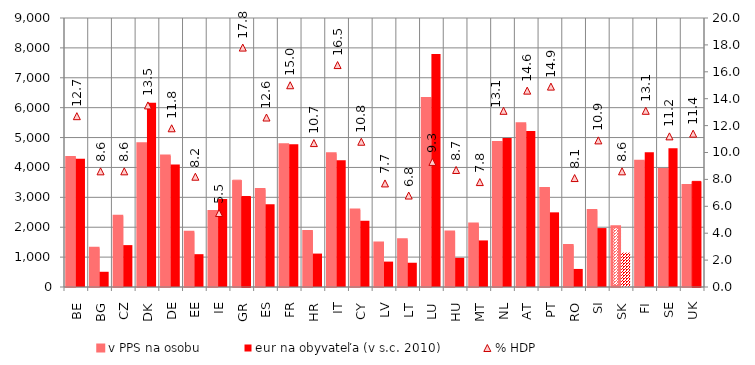
| Category | v PPS na osobu | eur na obyvateľa (v s.c. 2010) |
|---|---|---|
| BE | 4335.72 | 4288.49 |
| BG | 1292.3 | 509.42 |
| CZ | 2368.43 | 1401.28 |
| DK | 4789.89 | 6161.09 |
| DE | 4381.84 | 4101.75 |
| EE | 1827.97 | 1098.09 |
| IE | 2522.36 | 2941.98 |
| GR | 3573.8 | 3028.22 |
| ES | 3261.72 | 2768.6 |
| FR | 4761.47 | 4773.16 |
| HR | 1857.83 | 1118.34 |
| IT | 4459.66 | 4243.52 |
| CY | 2579.2 | 2216.09 |
| LV | 1472.59 | 849.8 |
| LT | 1576.84 | 811.75 |
| LU | 6302.65 | 7793.61 |
| HU | 1838.43 | 975.58 |
| MT | 2104.98 | 1558.36 |
| NL | 4834.14 | 4987.3 |
| AT | 5457.81 | 5222.71 |
| PT | 3293 | 2497.66 |
| RO | 1390.77 | 604.48 |
| SI | 2563.21 | 1971.54 |
| SK | 2016.28 | 1151.74 |
| FI | 4205.42 | 4511.24 |
| SE | 3931.09 | 4642.52 |
| UK | 3392.61 | 3533.69 |